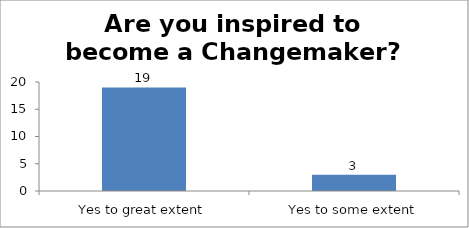
| Category | Are you inspired to become a Changemaker?   |
|---|---|
| Yes to great extent | 19 |
| Yes to some extent | 3 |